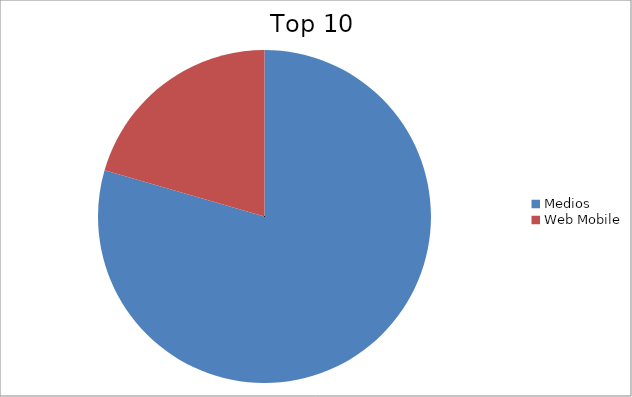
| Category | Series 0 |
|---|---|
| Medios | 79.48 |
| Web Mobile | 20.52 |